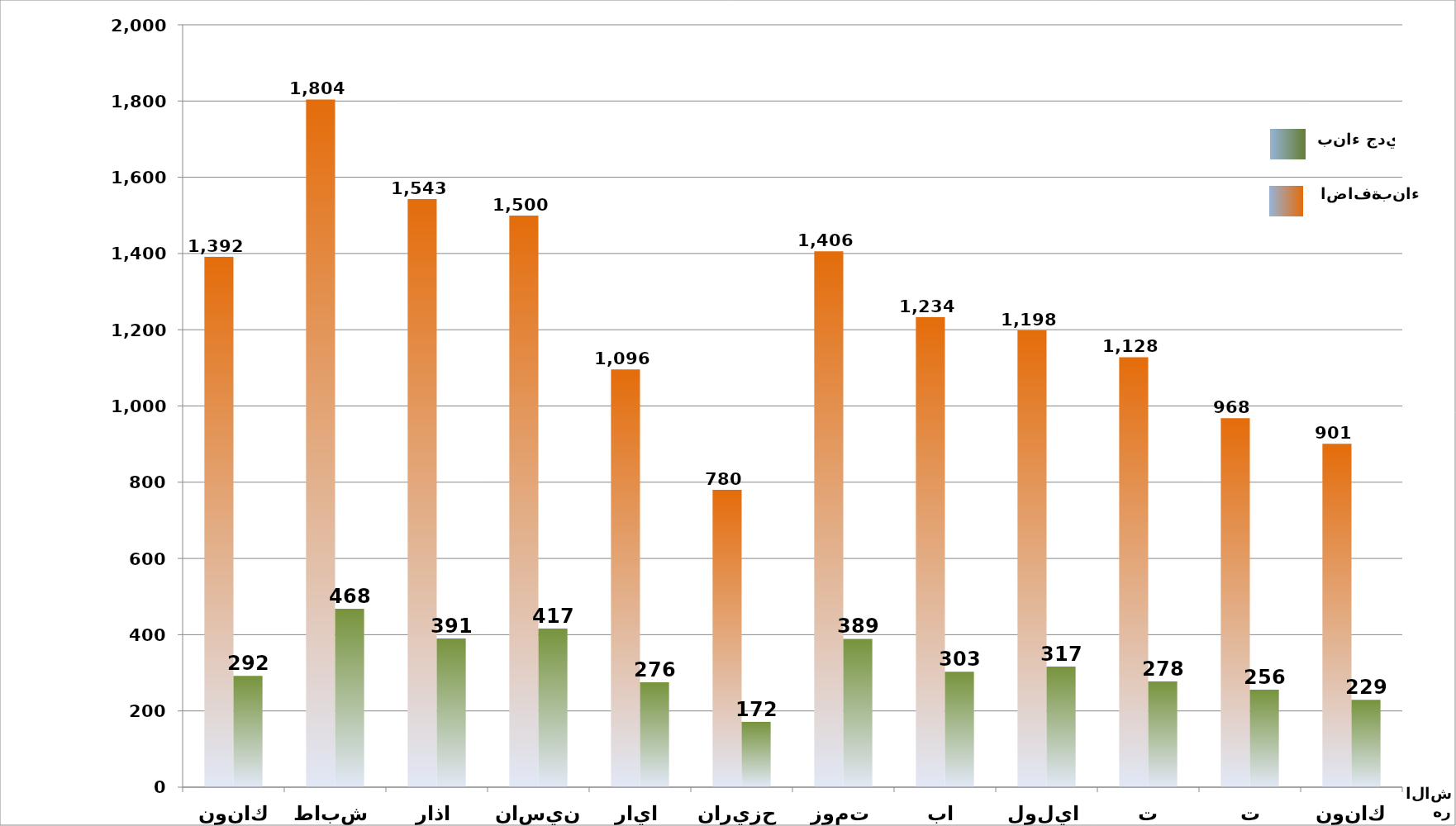
| Category | بناء جديد | اضافة بناء |
|---|---|---|
| كانون الثاني | 1392 | 292 |
| شباط | 1804 | 468 |
| اذار | 1543 | 391 |
| نيسان | 1500 | 417 |
| ايار | 1096 | 276 |
| حزيران | 780 | 172 |
| تموز | 1406 | 389 |
| اب | 1234 | 303 |
| ايلول | 1198 | 317 |
| تشرين الاول | 1128 | 278 |
| تشرين الثاني | 968 | 256 |
| كانون الاول | 901 | 229 |